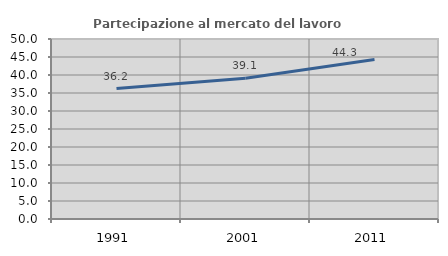
| Category | Partecipazione al mercato del lavoro  femminile |
|---|---|
| 1991.0 | 36.244 |
| 2001.0 | 39.098 |
| 2011.0 | 44.296 |